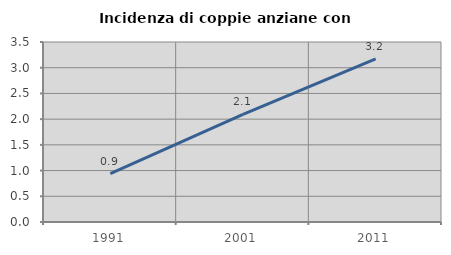
| Category | Incidenza di coppie anziane con figli |
|---|---|
| 1991.0 | 0.941 |
| 2001.0 | 2.094 |
| 2011.0 | 3.17 |